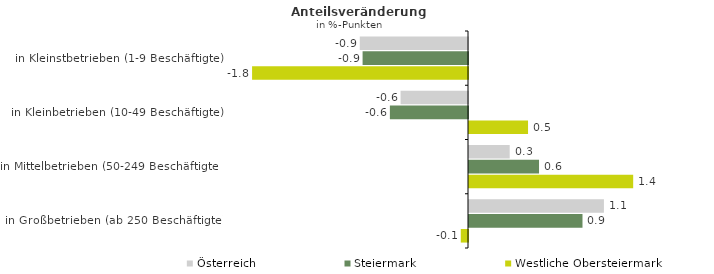
| Category | Österreich | Steiermark | Westliche Obersteiermark |
|---|---|---|---|
| in Kleinstbetrieben (1-9 Beschäftigte) | -0.898 | -0.875 | -1.792 |
| in Kleinbetrieben (10-49 Beschäftigte) | -0.559 | -0.648 | 0.49 |
| in Mittelbetrieben (50-249 Beschäftigte) | 0.338 | 0.581 | 1.363 |
| in Großbetrieben (ab 250 Beschäftigte) | 1.12 | 0.942 | -0.06 |